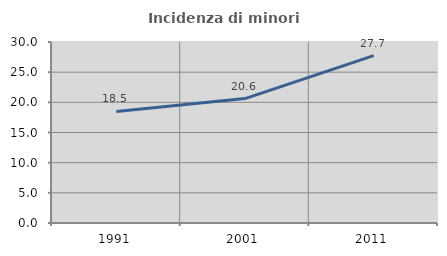
| Category | Incidenza di minori stranieri |
|---|---|
| 1991.0 | 18.487 |
| 2001.0 | 20.626 |
| 2011.0 | 27.744 |